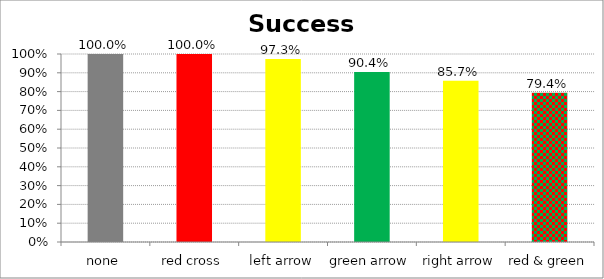
| Category | Success Rate |
|---|---|
| none | 1 |
| red cross | 1 |
| left arrow | 0.973 |
| green arrow | 0.904 |
| right arrow | 0.857 |
| red & green | 0.794 |